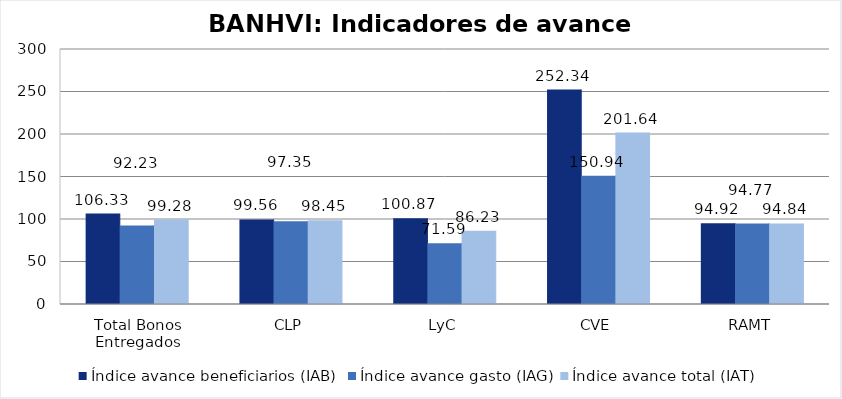
| Category | Índice avance beneficiarios (IAB)  | Índice avance gasto (IAG) | Índice avance total (IAT)  |
|---|---|---|---|
| Total Bonos Entregados | 106.332 | 92.233 | 99.282 |
| CLP | 99.558 | 97.351 | 98.455 |
| LyC | 100.875 | 71.59 | 86.232 |
| CVE | 252.344 | 150.937 | 201.64 |
| RAMT | 94.917 | 94.773 | 94.845 |